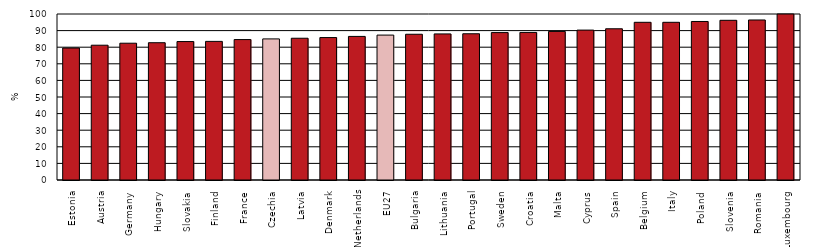
| Category | Series 0 |
|---|---|
| Estonia | 79.5 |
| Austria | 81.2 |
| Germany | 82.4 |
| Hungary | 82.7 |
| Slovakia | 83.4 |
| Finland | 83.5 |
| France | 84.6 |
| Czechia | 85 |
| Latvia | 85.4 |
| Denmark | 85.8 |
| Netherlands | 86.5 |
| EU27 | 87.3 |
| Bulgaria | 87.8 |
| Lithuania | 88 |
| Portugal | 88.1 |
| Sweden | 88.8 |
| Croatia | 88.9 |
| Malta | 89.5 |
| Cyprus | 90.3 |
| Spain | 91.1 |
| Belgium | 95 |
| Italy | 95 |
| Poland | 95.5 |
| Slovenia | 96.2 |
| Romania | 96.4 |
| Luxembourg | 100.2 |